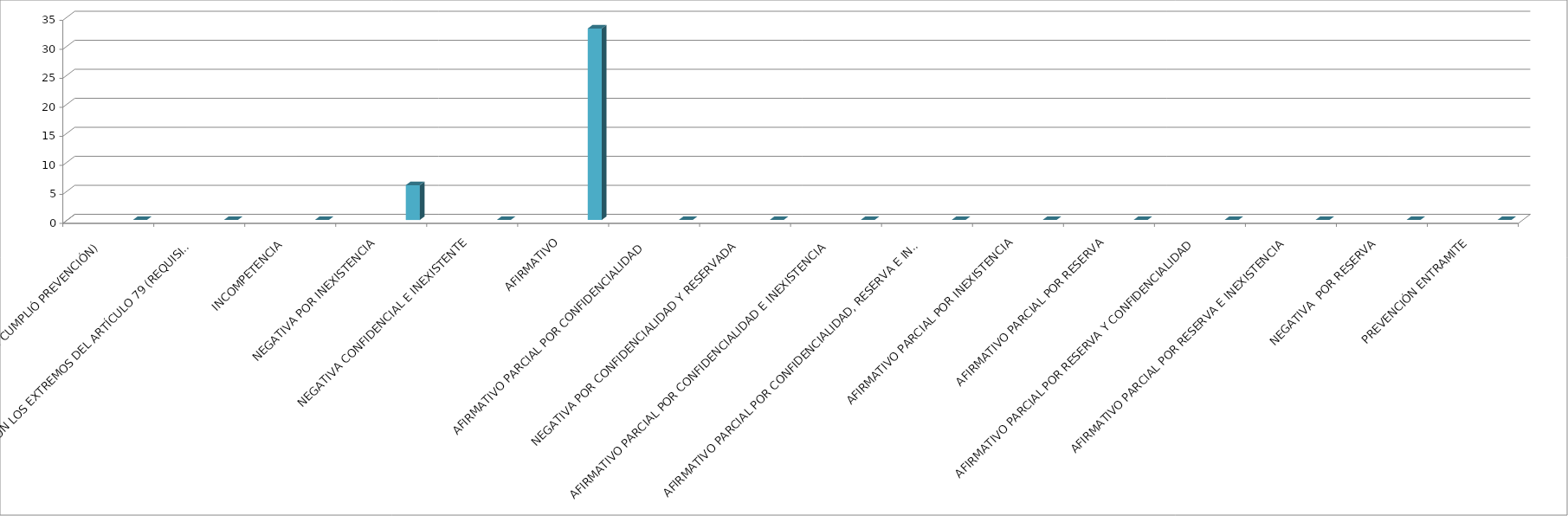
| Category | Series 0 | Series 1 | Series 2 | Series 3 | Series 4 |
|---|---|---|---|---|---|
| SE TIENE POR NO PRESENTADA ( NO CUMPLIÓ PREVENCIÓN) |  |  |  |  | 0 |
| NO CUMPLIO CON LOS EXTREMOS DEL ARTÍCULO 79 (REQUISITOS) |  |  |  |  | 0 |
| INCOMPETENCIA  |  |  |  |  | 0 |
| NEGATIVA POR INEXISTENCIA |  |  |  |  | 6 |
| NEGATIVA CONFIDENCIAL E INEXISTENTE |  |  |  |  | 0 |
| AFIRMATIVO |  |  |  |  | 33 |
| AFIRMATIVO PARCIAL POR CONFIDENCIALIDAD  |  |  |  |  | 0 |
| NEGATIVA POR CONFIDENCIALIDAD Y RESERVADA |  |  |  |  | 0 |
| AFIRMATIVO PARCIAL POR CONFIDENCIALIDAD E INEXISTENCIA |  |  |  |  | 0 |
| AFIRMATIVO PARCIAL POR CONFIDENCIALIDAD, RESERVA E INEXISTENCIA |  |  |  |  | 0 |
| AFIRMATIVO PARCIAL POR INEXISTENCIA |  |  |  |  | 0 |
| AFIRMATIVO PARCIAL POR RESERVA |  |  |  |  | 0 |
| AFIRMATIVO PARCIAL POR RESERVA Y CONFIDENCIALIDAD |  |  |  |  | 0 |
| AFIRMATIVO PARCIAL POR RESERVA E INEXISTENCIA |  |  |  |  | 0 |
| NEGATIVA  POR RESERVA |  |  |  |  | 0 |
| PREVENCIÓN ENTRAMITE |  |  |  |  | 0 |